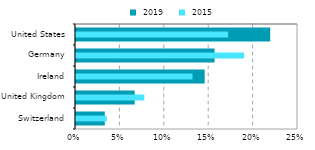
| Category |  2019 |
|---|---|
| Switzerland | 0.032 |
| United Kingdom | 0.066 |
| Ireland | 0.145 |
| Germany | 0.156 |
| United States | 0.219 |